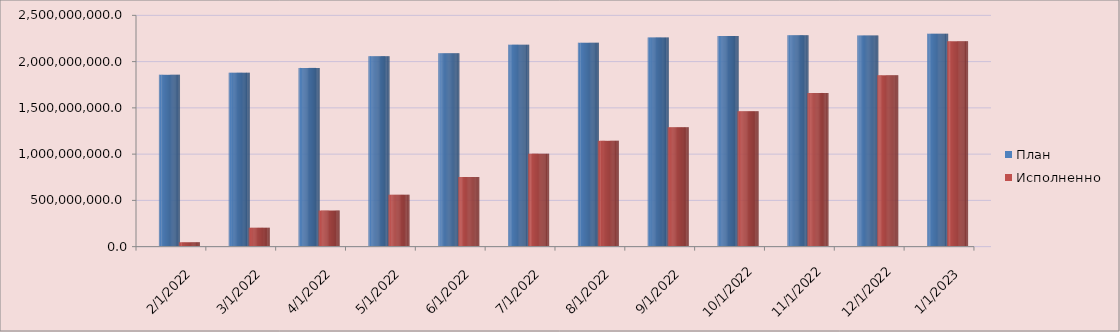
| Category | План | Исполненно |
|---|---|---|
| 2/1/22 | 1850176509 | 40083487.25 |
| 3/1/22 | 1873445595.4 | 197888289.53 |
| 4/1/22 | 1925061943 | 382703010.27 |
| 5/1/22 | 2052062640.37 | 554313312.95 |
| 6/1/22 | 2083657724.42 | 746143548.72 |
| 7/1/22 | 2176088775.61 | 998373618.3 |
| 8/1/22 | 2196703283.51 | 1136764172.16 |
| 9/1/22 | 2254521239.24 | 1284030874.87 |
| 10/1/22 | 2269898047.71 | 1456974140.62 |
| 11/1/22 | 2278906488.72 | 1654213807.37 |
| 12/1/22 | 2275790386.5 | 1844422212.62 |
| 1/1/23 | 2294551407.87 | 2212312636 |